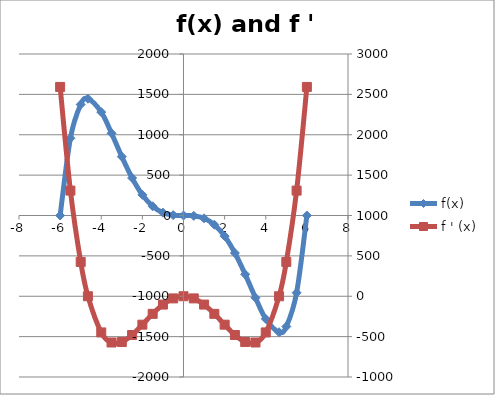
| Category | f(x) |
|---|---|
| -6.0 | 0 |
| -5.5 | 956.656 |
| -5.0 | 1375 |
| -4.647579836822011 | 1445.583 |
| -4.0 | 1280 |
| -3.5 | 1018.281 |
| -3.0 | 729 |
| -2.5 | 464.844 |
| -2.0 | 256 |
| -1.5 | 113.906 |
| -1.0 | 35 |
| -0.5 | 4.469 |
| 0.0 | 0 |
| 0.5 | -4.469 |
| 1.0 | -35 |
| 1.5 | -113.906 |
| 2.0 | -256 |
| 2.5 | -464.844 |
| 3.0 | -729 |
| 3.5 | -1018.281 |
| 4.0 | -1280 |
| 4.647579836822011 | -1445.583 |
| 5.0 | -1375 |
| 5.5 | -956.656 |
| 6.0 | 0 |